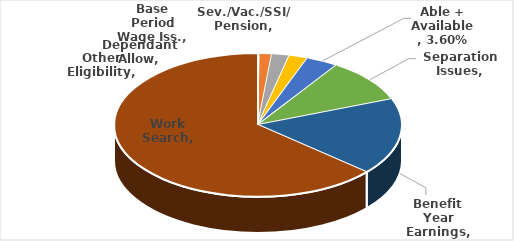
| Category | Series 0 |
|---|---|
| Dependant Allow | 0.002 |
| Base Period Wage Iss. | 0.014 |
| Sev./Vac./SSI/ Pension | 0.02 |
| Other Eligibility | 0.021 |
| Able + Available | 0.036 |
| Separation Issues | 0.099 |
| Benefit Year Earnings | 0.173 |
| Work Search | 0.636 |